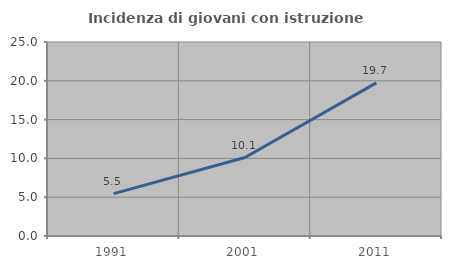
| Category | Incidenza di giovani con istruzione universitaria |
|---|---|
| 1991.0 | 5.464 |
| 2001.0 | 10.112 |
| 2011.0 | 19.737 |